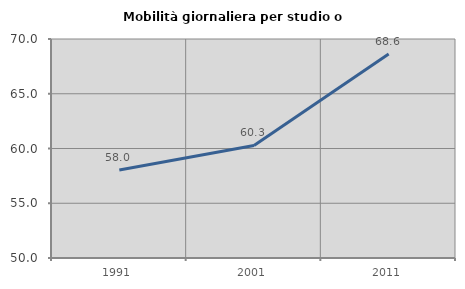
| Category | Mobilità giornaliera per studio o lavoro |
|---|---|
| 1991.0 | 58.031 |
| 2001.0 | 60.275 |
| 2011.0 | 68.629 |